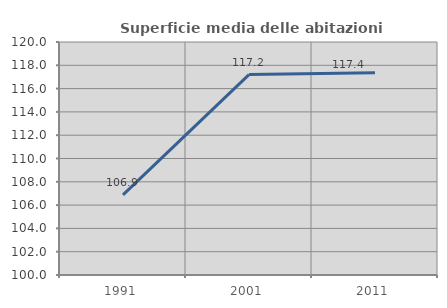
| Category | Superficie media delle abitazioni occupate |
|---|---|
| 1991.0 | 106.874 |
| 2001.0 | 117.2 |
| 2011.0 | 117.356 |